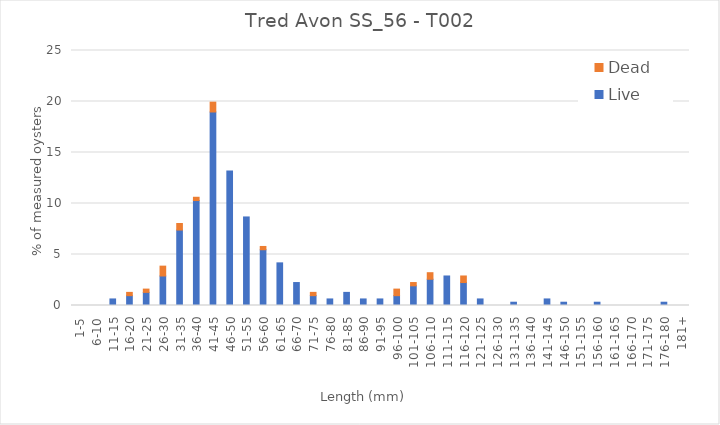
| Category | Live | Dead |
|---|---|---|
| 1-5 | 0 | 0 |
| 6-10 | 0 | 0 |
| 11-15 | 0.643 | 0 |
| 16-20 | 0.965 | 0.322 |
| 21-25 | 1.286 | 0.322 |
| 26-30 | 2.894 | 0.965 |
| 31-35 | 7.395 | 0.643 |
| 36-40 | 10.289 | 0.322 |
| 41-45 | 18.971 | 0.965 |
| 46-50 | 13.183 | 0 |
| 51-55 | 8.682 | 0 |
| 56-60 | 5.466 | 0.322 |
| 61-65 | 4.18 | 0 |
| 66-70 | 2.251 | 0 |
| 71-75 | 0.965 | 0.322 |
| 76-80 | 0.643 | 0 |
| 81-85 | 1.286 | 0 |
| 86-90 | 0.643 | 0 |
| 91-95 | 0.643 | 0 |
| 96-100 | 0.965 | 0.643 |
| 101-105 | 1.929 | 0.322 |
| 106-110 | 2.572 | 0.643 |
| 111-115 | 2.894 | 0 |
| 116-120 | 2.251 | 0.643 |
| 121-125 | 0.643 | 0 |
| 126-130 | 0 | 0 |
| 131-135 | 0.322 | 0 |
| 136-140 | 0 | 0 |
| 141-145 | 0.643 | 0 |
| 146-150 | 0.322 | 0 |
| 151-155 | 0 | 0 |
| 156-160 | 0.322 | 0 |
| 161-165 | 0 | 0 |
| 166-170 | 0 | 0 |
| 171-175 | 0 | 0 |
| 176-180 | 0.322 | 0 |
| 181+ | 0 | 0 |